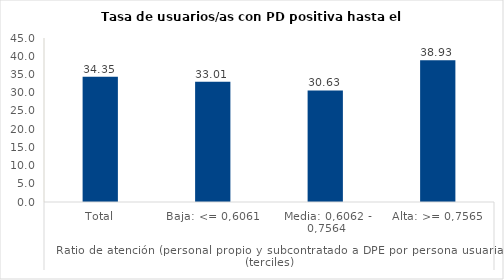
| Category | Series 0 |
|---|---|
| 0 | 34.355 |
| 1 | 33.009 |
| 2 | 30.628 |
| 3 | 38.925 |